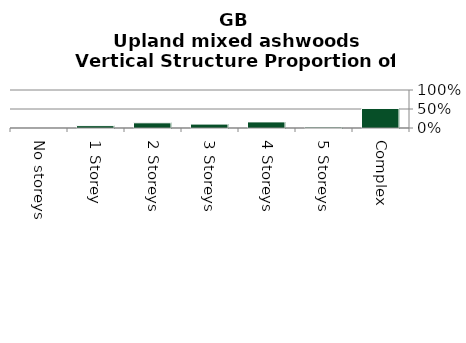
| Category | Upland mixed ashwoods |
|---|---|
| No storeys | 0 |
| 1 Storey | 0.062 |
| 2 Storeys | 0.137 |
| 3 Storeys | 0.103 |
| 4 Storeys | 0.16 |
| 5 Storeys | 0.024 |
| Complex | 0.513 |